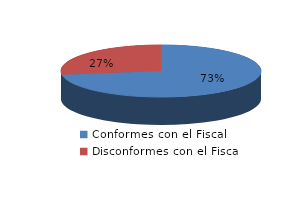
| Category | Series 0 |
|---|---|
| 0 | 1311 |
| 1 | 493 |